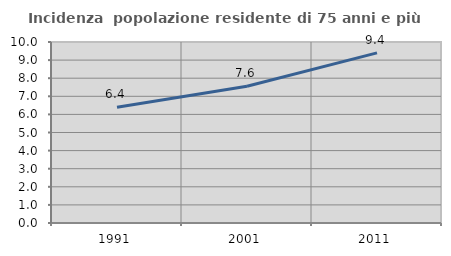
| Category | Incidenza  popolazione residente di 75 anni e più |
|---|---|
| 1991.0 | 6.397 |
| 2001.0 | 7.555 |
| 2011.0 | 9.401 |